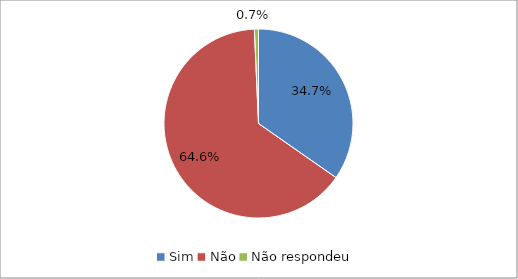
| Category | Series 0 |
|---|---|
| Sim | 0.347 |
| Não | 0.646 |
| Não respondeu | 0.007 |